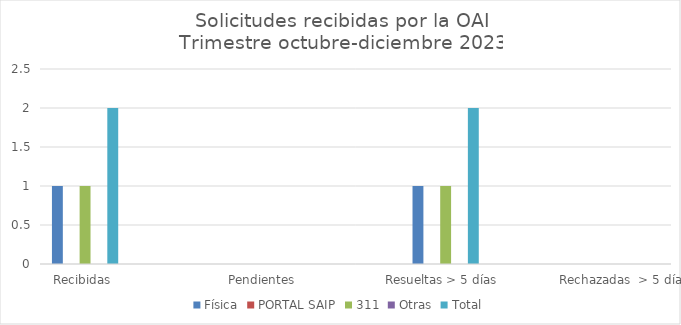
| Category | Física | PORTAL SAIP | 311 | Otras | Total |
|---|---|---|---|---|---|
| Recibidas  | 1 | 0 | 1 | 0 | 2 |
| Cambiadas a otra institución | 0 | 0 | 0 | 0 | 0 |
| Pendientes  | 0 | 0 | 0 | 0 | 0 |
| Resueltas < 5 días | 0 | 0 | 0 | 0 | 0 |
| Resueltas > 5 días  | 1 | 0 | 1 | 0 | 2 |
| Rechazadas  < 5 días | 0 | 0 | 0 | 0 | 0 |
| Rechazadas  > 5 días | 0 | 0 | 0 | 0 | 0 |